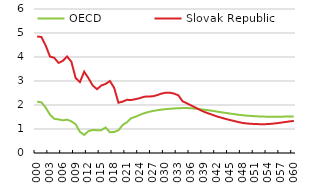
| Category | OECD | Slovak Republic |
|---|---|---|
| 2000.0 | 2.136 | 4.856 |
| 2001.0 | 2.111 | 4.833 |
| 2002.0 | 1.892 | 4.477 |
| 2003.0 | 1.597 | 4.018 |
| 2004.0 | 1.426 | 3.967 |
| 2005.0 | 1.4 | 3.753 |
| 2006.0 | 1.362 | 3.84 |
| 2007.0 | 1.39 | 4.022 |
| 2008.0 | 1.319 | 3.804 |
| 2009.0 | 1.197 | 3.123 |
| 2010.0 | 0.881 | 2.955 |
| 2011.0 | 0.754 | 3.389 |
| 2012.0 | 0.912 | 3.116 |
| 2013.0 | 0.959 | 2.81 |
| 2014.0 | 0.95 | 2.658 |
| 2015.0 | 0.952 | 2.813 |
| 2016.0 | 1.064 | 2.877 |
| 2017.0 | 0.865 | 3 |
| 2018.0 | 0.878 | 2.717 |
| 2019.0 | 0.944 | 2.094 |
| 2020.0 | 1.169 | 2.142 |
| 2021.0 | 1.282 | 2.216 |
| 2022.0 | 1.452 | 2.208 |
| 2023.0 | 1.512 | 2.245 |
| 2024.0 | 1.59 | 2.284 |
| 2025.0 | 1.656 | 2.347 |
| 2026.0 | 1.709 | 2.353 |
| 2027.0 | 1.749 | 2.363 |
| 2028.0 | 1.78 | 2.408 |
| 2029.0 | 1.805 | 2.473 |
| 2030.0 | 1.826 | 2.509 |
| 2031.0 | 1.842 | 2.515 |
| 2032.0 | 1.855 | 2.475 |
| 2033.0 | 1.866 | 2.404 |
| 2034.0 | 1.871 | 2.153 |
| 2035.0 | 1.872 | 2.072 |
| 2036.0 | 1.864 | 1.982 |
| 2037.0 | 1.846 | 1.893 |
| 2038.0 | 1.826 | 1.802 |
| 2039.0 | 1.804 | 1.717 |
| 2040.0 | 1.781 | 1.652 |
| 2041.0 | 1.755 | 1.589 |
| 2042.0 | 1.727 | 1.524 |
| 2043.0 | 1.698 | 1.474 |
| 2044.0 | 1.672 | 1.423 |
| 2045.0 | 1.646 | 1.378 |
| 2046.0 | 1.62 | 1.335 |
| 2047.0 | 1.594 | 1.29 |
| 2048.0 | 1.574 | 1.253 |
| 2049.0 | 1.557 | 1.231 |
| 2050.0 | 1.543 | 1.216 |
| 2051.0 | 1.532 | 1.206 |
| 2052.0 | 1.523 | 1.202 |
| 2053.0 | 1.516 | 1.201 |
| 2054.0 | 1.513 | 1.204 |
| 2055.0 | 1.512 | 1.222 |
| 2056.0 | 1.513 | 1.241 |
| 2057.0 | 1.514 | 1.265 |
| 2058.0 | 1.516 | 1.291 |
| 2059.0 | 1.519 | 1.316 |
| 2060.0 | 1.52 | 1.339 |